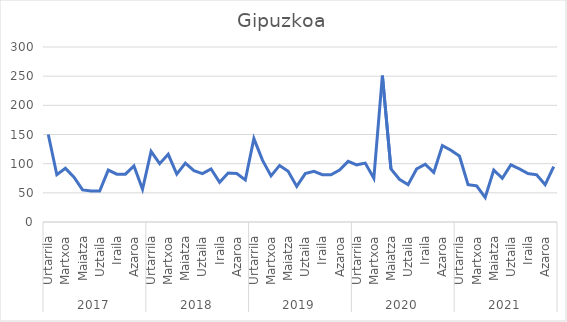
| Category | Gipuzkoa |
|---|---|
| 0 | 150 |
| 1 | 81 |
| 2 | 92 |
| 3 | 77 |
| 4 | 55 |
| 5 | 53 |
| 6 | 53 |
| 7 | 89 |
| 8 | 82 |
| 9 | 82 |
| 10 | 96 |
| 11 | 56 |
| 12 | 121 |
| 13 | 100 |
| 14 | 116 |
| 15 | 82 |
| 16 | 101 |
| 17 | 88 |
| 18 | 83 |
| 19 | 91 |
| 20 | 68 |
| 21 | 84 |
| 22 | 83 |
| 23 | 72 |
| 24 | 143 |
| 25 | 106 |
| 26 | 79 |
| 27 | 97 |
| 28 | 87 |
| 29 | 61 |
| 30 | 83 |
| 31 | 87 |
| 32 | 81 |
| 33 | 81 |
| 34 | 89 |
| 35 | 104 |
| 36 | 98 |
| 37 | 101 |
| 38 | 75 |
| 39 | 251 |
| 40 | 91 |
| 41 | 73 |
| 42 | 64 |
| 43 | 91 |
| 44 | 99 |
| 45 | 85 |
| 46 | 131 |
| 47 | 123 |
| 48 | 113 |
| 49 | 64 |
| 50 | 62 |
| 51 | 42 |
| 52 | 89 |
| 53 | 75 |
| 54 | 98 |
| 55 | 91 |
| 56 | 83 |
| 57 | 81 |
| 58 | 64 |
| 59 | 95 |